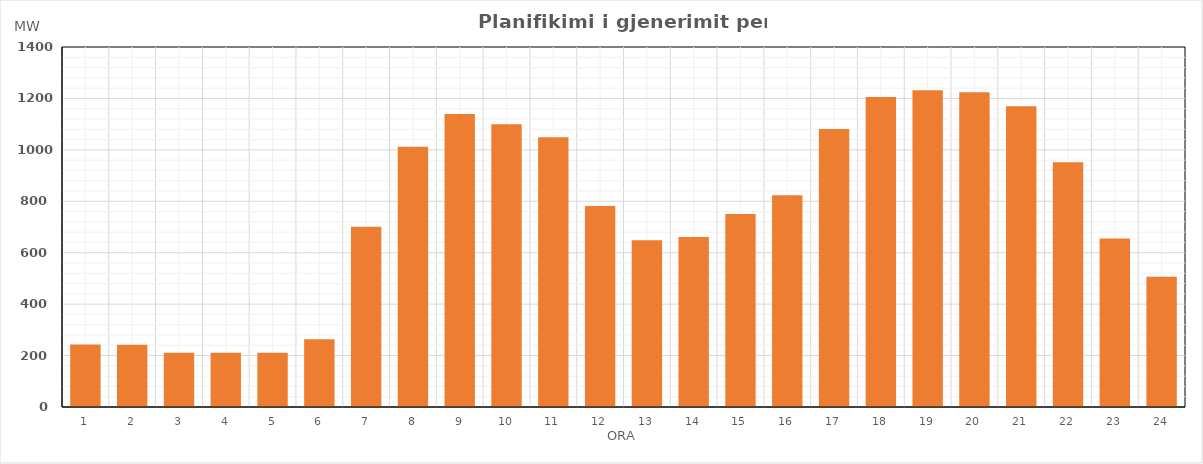
| Category | Max (MW) |
|---|---|
| 0 | 243.41 |
| 1 | 242.41 |
| 2 | 211.2 |
| 3 | 211.2 |
| 4 | 211.2 |
| 5 | 263.515 |
| 6 | 701.2 |
| 7 | 1011.887 |
| 8 | 1139.882 |
| 9 | 1099.854 |
| 10 | 1049.3 |
| 11 | 781.623 |
| 12 | 648.3 |
| 13 | 661.3 |
| 14 | 750.3 |
| 15 | 823.3 |
| 16 | 1081.572 |
| 17 | 1205.291 |
| 18 | 1231.571 |
| 19 | 1224.401 |
| 20 | 1169.205 |
| 21 | 951.415 |
| 22 | 655.2 |
| 23 | 506.2 |